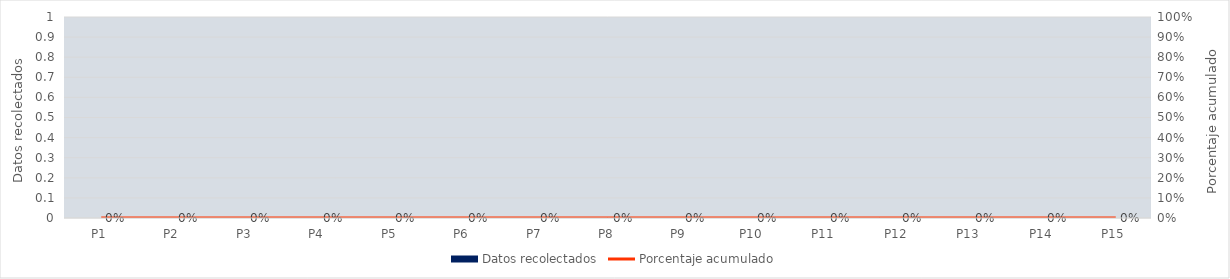
| Category | Datos recolectados |
|---|---|
| P1 | 60 |
| P2 | 50 |
| P3 | 48 |
| P4 | 43 |
| P5 | 33 |
| P6 | 28 |
| P7 | 28 |
| P8 | 27 |
| P9 | 23 |
| P10 | 19 |
| P11 | 19 |
| P12 | 18 |
| P13 | 15 |
| P14 | 14 |
| P15 | 12 |